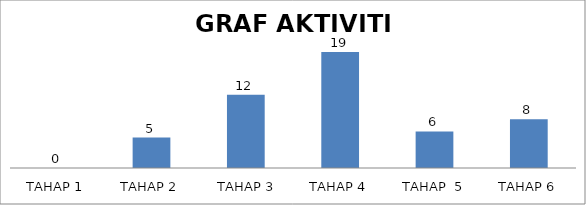
| Category | Series 0 |
|---|---|
| TAHAP 1 | 0 |
| TAHAP 2 | 5 |
|  TAHAP 3 | 12 |
| TAHAP 4 | 19 |
| TAHAP  5 | 6 |
| TAHAP 6 | 8 |